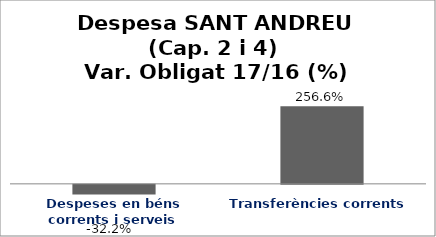
| Category | Series 0 |
|---|---|
| Despeses en béns corrents i serveis | -0.322 |
| Transferències corrents | 2.566 |